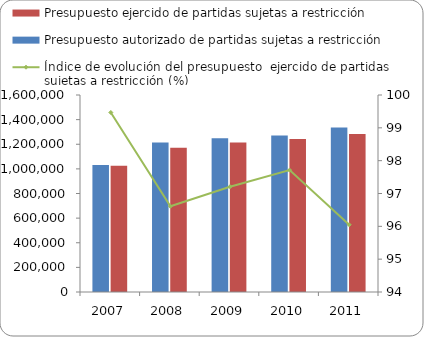
| Category | Presupuesto autorizado de partidas sujetas a restricción | Presupuesto ejercido de partidas sujetas a restricción  |
|---|---|---|
| 2007 | 1030993 | 1025505 |
| 2008 | 1213247 | 1172131 |
| 2009 | 1249220 | 1214312 |
| 2010 | 1271711.48 | 1242620.47 |
| 2011 | 1336369.4 | 1283563.8 |